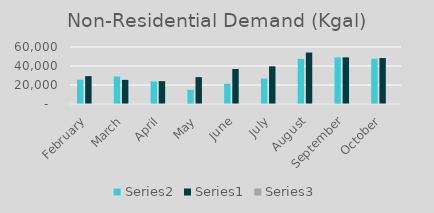
| Category | Series 1 | Series 0 | Series 2 |
|---|---|---|---|
| February | 25488 | 29366 | 0.868 |
| March | 28967 | 25412 | 1.14 |
| April | 23746 | 24018 | 0.989 |
| May | 14933 | 28279 | 0.528 |
| June | 21309 | 36817 | 0.579 |
| July | 26764 | 39671 | 0.675 |
| August | 47532 | 54156 | 0.878 |
| September | 49007 | 49071 | 0.999 |
| October | 47640 | 48372 | 0.985 |